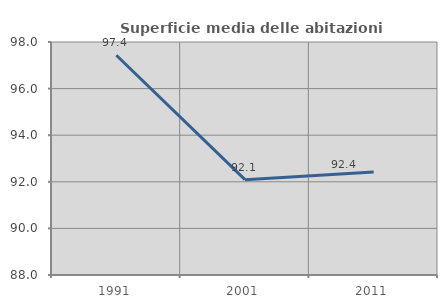
| Category | Superficie media delle abitazioni occupate |
|---|---|
| 1991.0 | 97.433 |
| 2001.0 | 92.093 |
| 2011.0 | 92.419 |